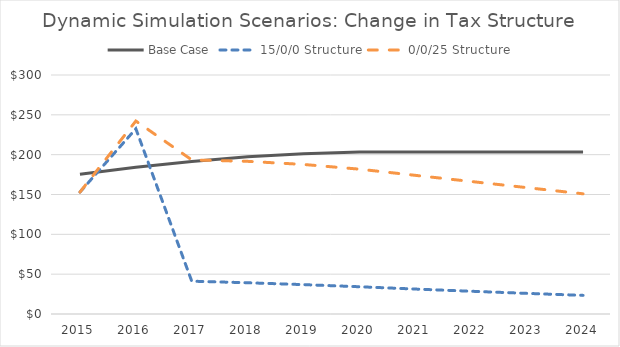
| Category | Base Case  | 15/0/0 Structure | 0/0/25 Structure |
|---|---|---|---|
| 2015.0 | 175.364 | 153 | 153 |
| 2016.0 | 184.133 | 232.518 | 242.216 |
| 2017.0 | 191.498 | 41.178 | 193.432 |
| 2018.0 | 197.243 | 39.21 | 191.618 |
| 2019.0 | 201.188 | 36.863 | 187.714 |
| 2020.0 | 203.2 | 34.203 | 181.807 |
| 2021.0 | 203.2 | 31.306 | 174.047 |
| 2022.0 | 203.2 | 28.537 | 166.308 |
| 2023.0 | 203.2 | 25.891 | 158.581 |
| 2024.0 | 203.2 | 23.367 | 150.859 |